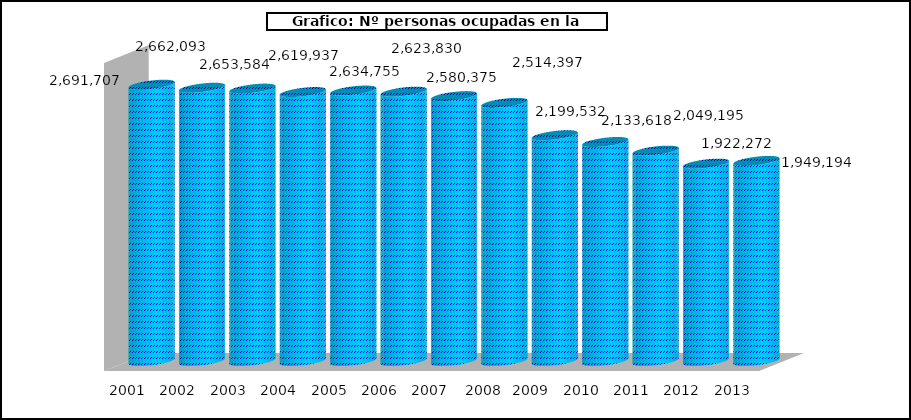
| Category |  Nº personas ocupadas |
|---|---|
| 2001 | 2691707 |
| 2002 | 2662093 |
| 2003 | 2653584 |
| 2004 | 2619937 |
| 2005 | 2634755 |
| 2006 | 2623830 |
| 2007 | 2580375 |
|  2008 * | 2514397 |
| 2009 | 2199532 |
| 2010 | 2133618 |
| 2011 | 2049195 |
| 2012 | 1922272 |
| 2013 | 1949194 |